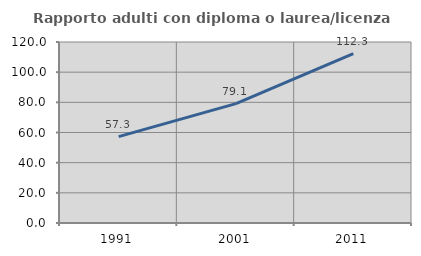
| Category | Rapporto adulti con diploma o laurea/licenza media  |
|---|---|
| 1991.0 | 57.277 |
| 2001.0 | 79.135 |
| 2011.0 | 112.304 |